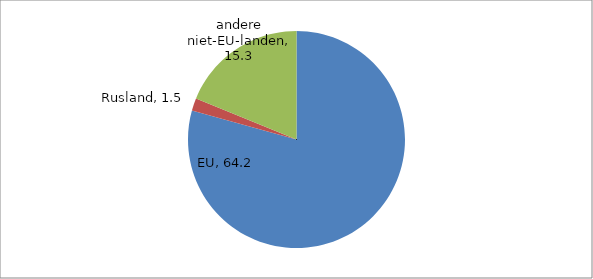
| Category | Series 0 |
|---|---|
| EU | 64.191 |
| Rusland | 1.504 |
| andere niet-EU-landen | 15.259 |